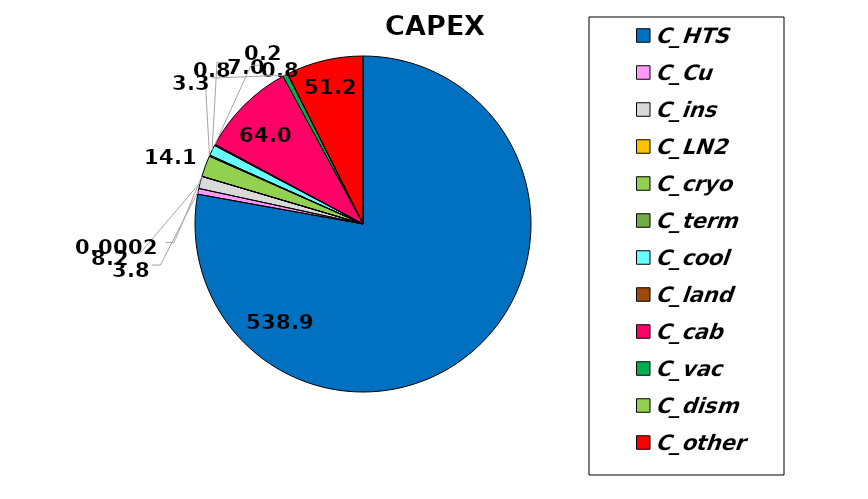
| Category | Series 0 |
|---|---|
| C_HTS | 538.872 |
| C_Cu | 3.824 |
| C_ins | 8.202 |
| C_LN2 | 0 |
| C_cryo | 14.08 |
| C_term | 0.8 |
| C_cool | 7.033 |
| C_land | 0.768 |
| C_cab | 64 |
| C_vac | 3.328 |
| C_dism | 0.182 |
| C_other | 51.2 |